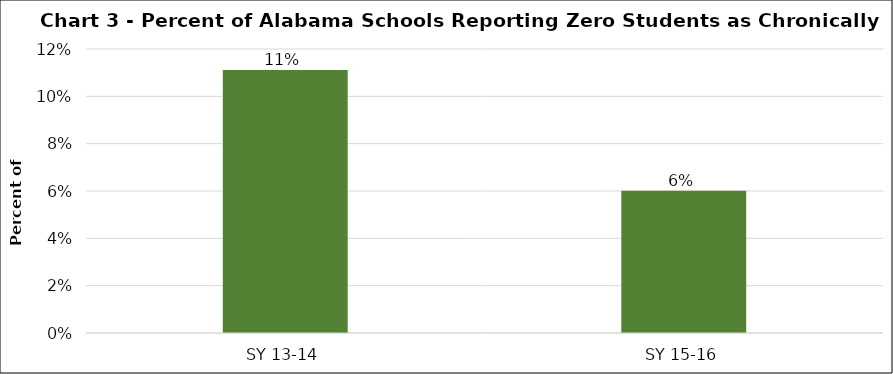
| Category | Series 0 |
|---|---|
| SY 13-14 | 0.111 |
| SY 15-16 | 0.06 |